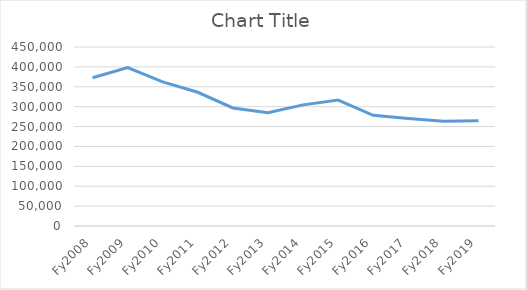
| Category | Series 0 |
|---|---|
| Fy2008 | 372539.029 |
| Fy2009 | 398358.637 |
| Fy2010 | 362129.819 |
| Fy2011 | 336218.266 |
| Fy2012 | 296795.751 |
| Fy2013 | 284729.948 |
| Fy2014 | 304545.011 |
| Fy2015 | 316605.126 |
| Fy2016 | 278407.146 |
| Fy2017 | 270026.212 |
| Fy2018 | 263596.86 |
| Fy2019 | 264481.173 |